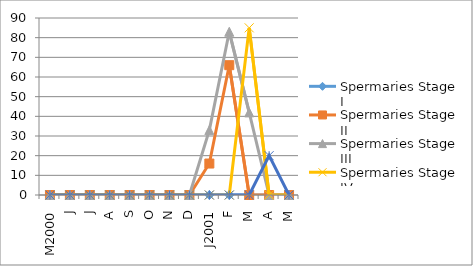
| Category | Spermaries |
|---|---|
| M2000 | 0 |
| J | 0 |
| J | 0 |
| A | 0 |
| S | 0 |
| O | 0 |
| N | 0 |
| D | 0 |
| J2001 | 0 |
| F | 0 |
| M | 0 |
| A | 20 |
| M | 0 |